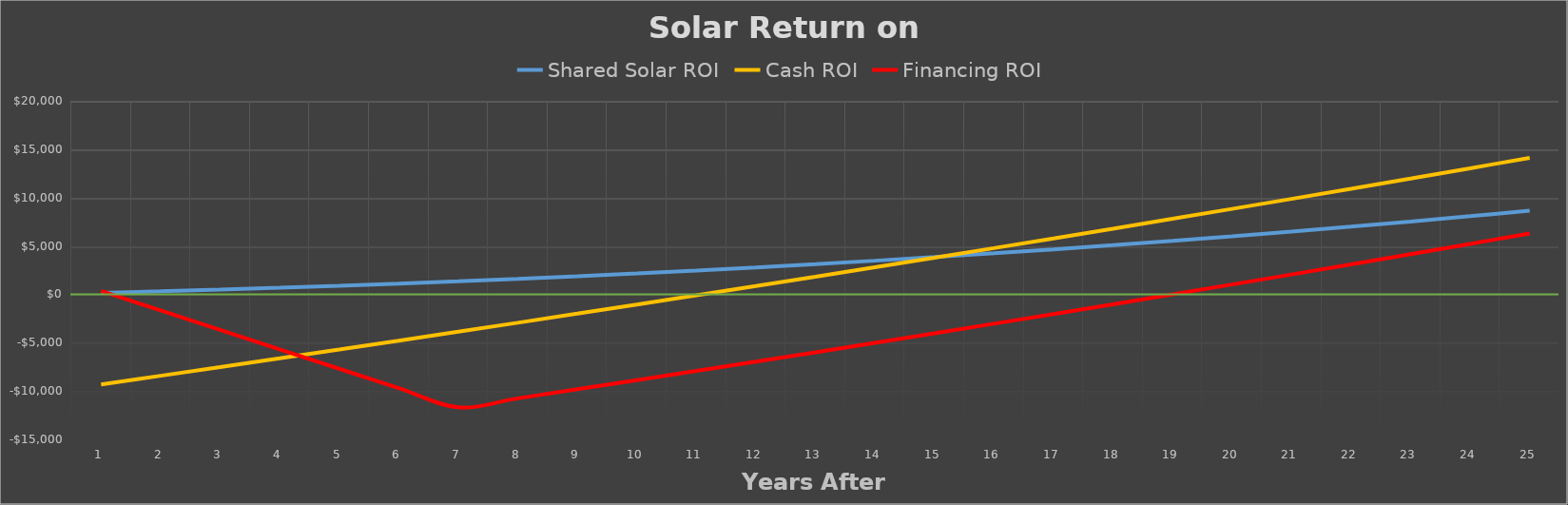
| Category | Shared Solar ROI | Cash ROI | Financing ROI |
|---|---|---|---|
| 0 | 145.564 | -9317.773 | 354.952 |
| 1 | 305.944 | -8426.846 | -1668.895 |
| 2 | 481.364 | -7529.588 | -3686.412 |
| 3 | 672.05 | -6625.867 | -5697.467 |
| 4 | 878.229 | -5715.551 | -7701.925 |
| 5 | 1100.135 | -4798.503 | -9699.651 |
| 6 | 1338.003 | -3874.584 | -11690.508 |
| 7 | 1592.073 | -2943.656 | -10759.58 |
| 8 | 1862.588 | -2005.576 | -9821.5 |
| 9 | 2149.794 | -1060.2 | -8876.124 |
| 10 | 2453.942 | -107.382 | -7923.305 |
| 11 | 2775.286 | 853.028 | -6962.896 |
| 12 | 3114.084 | 1821.178 | -5994.745 |
| 13 | 3470.597 | 2797.224 | -5018.7 |
| 14 | 3845.093 | 3781.319 | -4034.604 |
| 15 | 4237.839 | 4773.622 | -3042.301 |
| 16 | 4649.11 | 5774.293 | -2041.631 |
| 17 | 5079.185 | 6783.493 | -1032.43 |
| 18 | 5528.344 | 7801.389 | -14.535 |
| 19 | 5996.874 | 8828.146 | 1012.223 |
| 20 | 6485.066 | 9863.936 | 2048.012 |
| 21 | 6993.214 | 10908.929 | 3093.006 |
| 22 | 7521.619 | 11963.302 | 4147.379 |
| 23 | 8070.583 | 13027.232 | 5211.309 |
| 24 | 8640.416 | 14100.899 | 6284.976 |